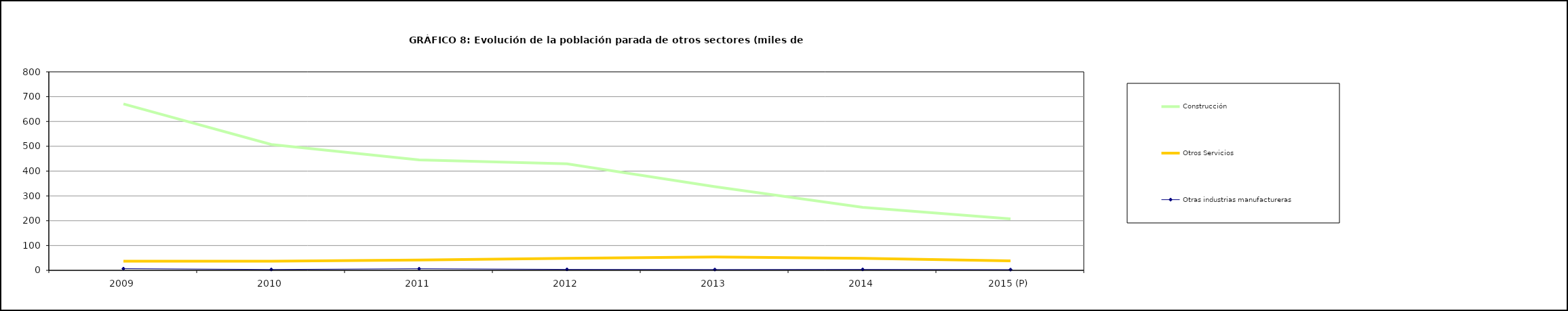
| Category | Construcción | Otros Servicios | Otras industrias manufactureras |
|---|---|---|---|
| 2009 | 670.55 | 37.15 | 6.875 |
| 2010 | 507.325 | 36.775 | 3.475 |
| 2011 | 445 | 41.375 | 6.55 |
| 2012 | 429.35 | 48.3 | 3.85 |
| 2013 | 337.3 | 53.6 | 3.3 |
| 2014 | 253.7 | 48.725 | 3.775 |
| 2015 (P) | 207.3 | 38 | 2.9 |